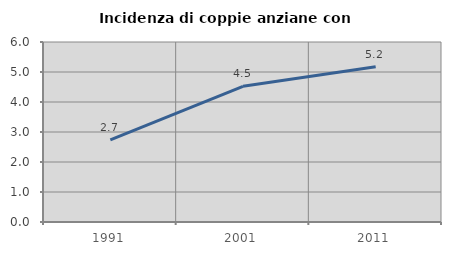
| Category | Incidenza di coppie anziane con figli |
|---|---|
| 1991.0 | 2.738 |
| 2001.0 | 4.522 |
| 2011.0 | 5.172 |